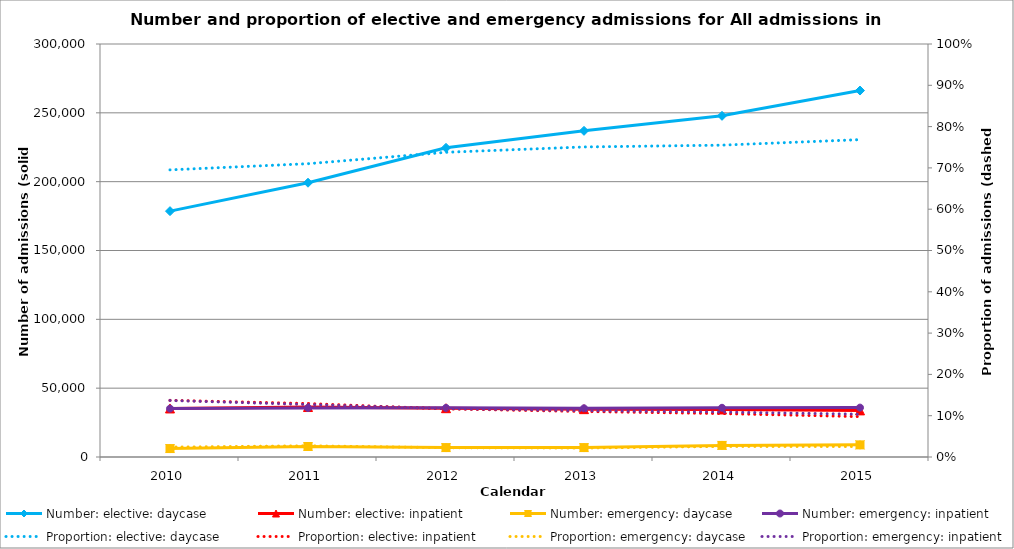
| Category | Number: elective: daycase | Number: elective: inpatient | Number: emergency: daycase | Number: emergency: inpatient |
|---|---|---|---|---|
| 2010.0 | 178583 | 35254 | 6139 | 35149 |
| 2011.0 | 199232 | 36300 | 7624 | 35640 |
| 2012.0 | 224592 | 35454 | 6847 | 35687 |
| 2013.0 | 236918 | 34754 | 6849 | 35362 |
| 2014.0 | 247830 | 34519 | 8414 | 35744 |
| 2015.0 | 266194 | 33857 | 8812 | 35879 |